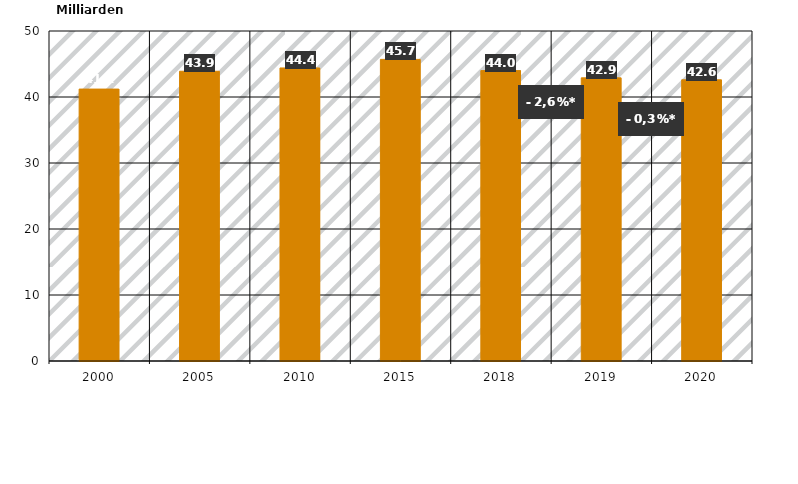
| Category | Verpackungen gesamt |
|---|---|
| 2000.0 | 41.2 |
| 2005.0 | 43.9 |
| 2010.0 | 44.4 |
| 2015.0 | 45.7 |
| 2018.0 | 44 |
| 2019.0 | 42.9 |
| 2020.0 | 42.6 |